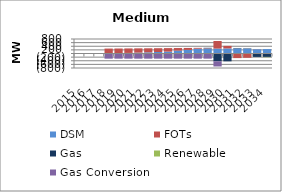
| Category | DSM | FOTs | Gas | Renewable | Gas Conversion |
|---|---|---|---|---|---|
| 2015.0 | 0 | 0 | 0 | 0 | 0 |
| 2016.0 | 0 | 0 | 0 | 0 | 0 |
| 2017.0 | 0 | 0 | 0 | 0 | 0 |
| 2018.0 | 8.17 | 263.815 | 0 | 0 | -285 |
| 2019.0 | 18.25 | 257.185 | 0 | 0 | -285 |
| 2020.0 | 31.5 | 248.363 | 0 | 0 | -285 |
| 2021.0 | 48.09 | 236.149 | 0 | 0 | -285 |
| 2022.0 | 63.64 | 223.984 | 0 | 0 | -285 |
| 2023.0 | 83.34 | 208.78 | 0 | 0 | -285 |
| 2024.0 | 103.57 | 193.748 | 0 | 0 | -285 |
| 2025.0 | 159.72 | 141.834 | 0 | 0 | -285 |
| 2026.0 | 198.22 | 107.547 | 0 | 0 | -285 |
| 2027.0 | 263.64 | 46.023 | 0 | 0 | -285 |
| 2028.0 | 266.92 | 23.574 | 22.984 | 0 | -285 |
| 2029.0 | 270.89 | 418.334 | -431.426 | 0 | -285 |
| 2030.0 | 279.96 | 141.187 | -431.426 | 0 | 0 |
| 2031.0 | 276.44 | -253.479 | 22.984 | 0 | 0 |
| 2032.0 | 259.78 | -237.022 | 22.984 | 0 | 0 |
| 2033.0 | 234.7 | 4.86 | -189.016 | 0 | 0 |
| 2034.0 | 244.25 | -0.005 | -189.016 | -15.757 | 0 |